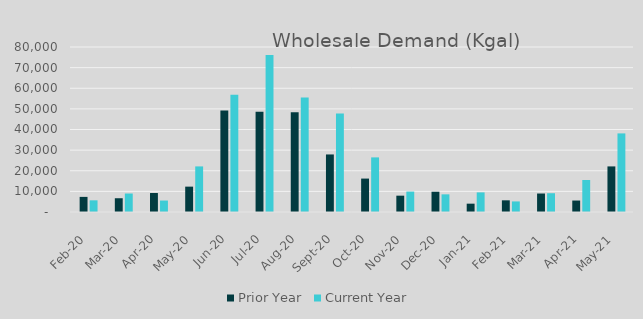
| Category | Prior Year | Current Year |
|---|---|---|
| 2020-02-01 | 7328 | 5662 |
| 2020-03-01 | 6673 | 8964 |
| 2020-04-01 | 9201 | 5557 |
| 2020-05-01 | 12299 | 22105 |
| 2020-06-01 | 49180 | 56817 |
| 2020-07-01 | 48620 | 76109 |
| 2020-08-01 | 48323 | 55541 |
| 2020-09-01 | 27902 | 47807 |
| 2020-10-01 | 16206 | 26480 |
| 2020-11-01 | 7918 | 9900 |
| 2020-12-01 | 9824 | 8560 |
| 2021-01-01 | 4042 | 9512 |
| 2021-02-01 | 5662 | 5125 |
| 2021-03-01 | 8964 | 9106 |
| 2021-04-01 | 5557 | 15528 |
| 2021-05-01 | 22105 | 38104 |